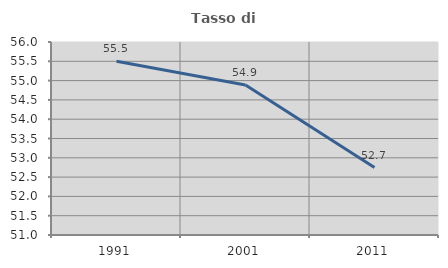
| Category | Tasso di occupazione   |
|---|---|
| 1991.0 | 55.5 |
| 2001.0 | 54.888 |
| 2011.0 | 52.748 |